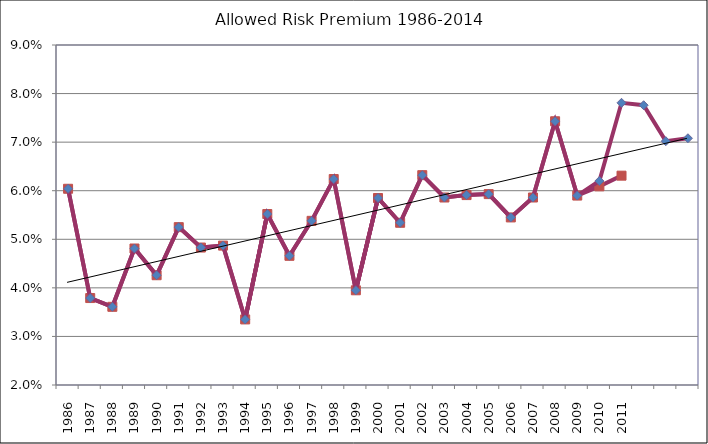
| Category | Series 1 | Series 0 |
|---|---|---|
| 1986 | 0.06 | 0.06 |
| 1987 | 0.038 | 0.038 |
| 1988 | 0.036 | 0.036 |
| 1989 | 0.048 | 0.048 |
| 1990 | 0.043 | 0.043 |
| 1991 | 0.053 | 0.053 |
| 1992 | 0.048 | 0.048 |
| 1993 | 0.049 | 0.049 |
| 1994 | 0.034 | 0.034 |
| 1995 | 0.055 | 0.055 |
| 1996 | 0.047 | 0.047 |
| 1997 | 0.054 | 0.054 |
| 1998 | 0.062 | 0.062 |
| 1999 | 0.04 | 0.04 |
| 2000 | 0.058 | 0.058 |
| 2001 | 0.053 | 0.053 |
| 2002 | 0.063 | 0.063 |
| 2003 | 0.059 | 0.059 |
| 2004 | 0.059 | 0.059 |
| 2005 | 0.059 | 0.059 |
| 2006 | 0.054 | 0.054 |
| 2007 | 0.059 | 0.059 |
| 2008 | 0.074 | 0.074 |
| 2009 | 0.059 | 0.059 |
| 2010 | 0.061 | 0.062 |
| 2011 | 0.063 | 0.078 |